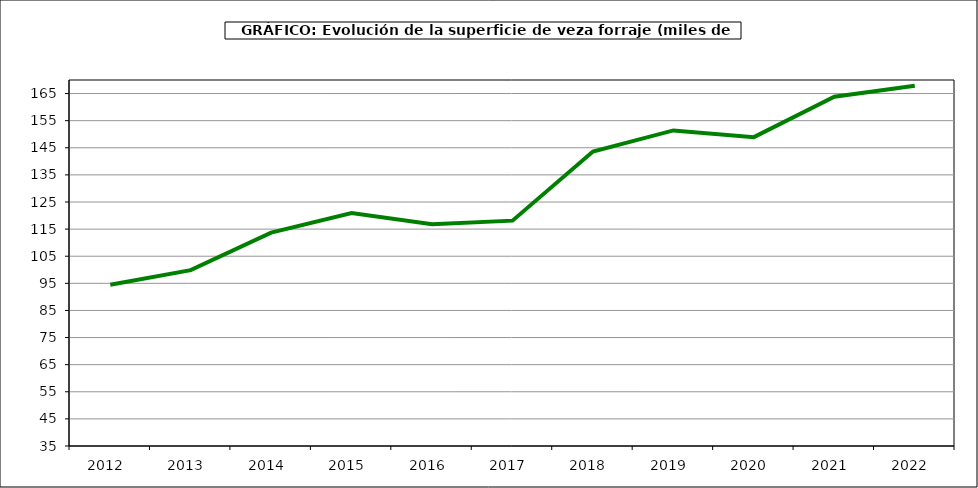
| Category | Superficie |
|---|---|
| 2012.0 | 94.499 |
| 2013.0 | 99.877 |
| 2014.0 | 113.725 |
| 2015.0 | 120.903 |
| 2016.0 | 116.796 |
| 2017.0 | 118.119 |
| 2018.0 | 143.634 |
| 2019.0 | 151.404 |
| 2020.0 | 148.924 |
| 2021.0 | 163.85 |
| 2022.0 | 167.848 |